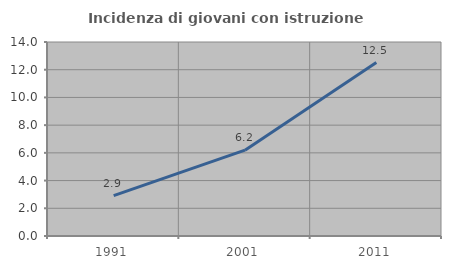
| Category | Incidenza di giovani con istruzione universitaria |
|---|---|
| 1991.0 | 2.919 |
| 2001.0 | 6.196 |
| 2011.0 | 12.519 |